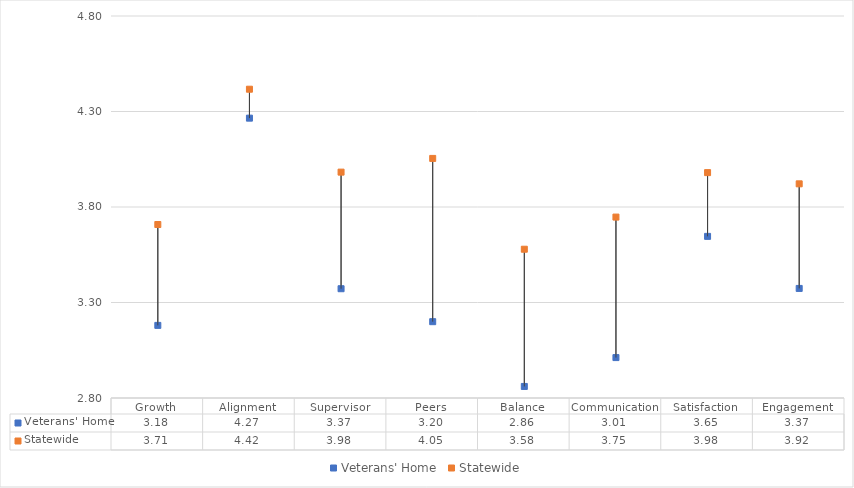
| Category | Veterans' Home | Statewide |
|---|---|---|
| Growth | 3.18 | 3.708 |
| Alignment | 4.265 | 4.417 |
| Supervisor | 3.372 | 3.983 |
| Peers | 3.2 | 4.054 |
| Balance | 2.86 | 3.579 |
| Communication | 3.012 | 3.747 |
| Satisfaction | 3.646 | 3.98 |
| Engagement | 3.374 | 3.921 |